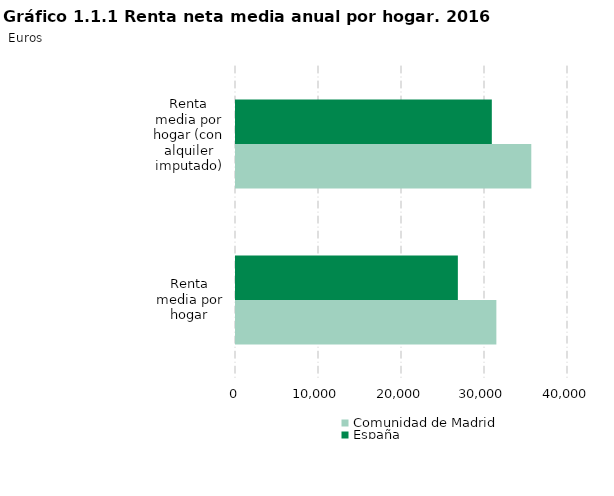
| Category | Comunidad de Madrid | España |
|---|---|---|
| Renta media por hogar | 31370 | 26730 |
| Renta media por hogar (con alquiler imputado) | 35577 | 30822 |